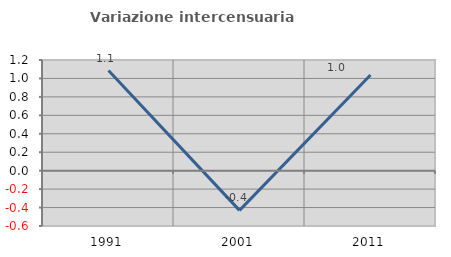
| Category | Variazione intercensuaria annua |
|---|---|
| 1991.0 | 1.086 |
| 2001.0 | -0.43 |
| 2011.0 | 1.038 |